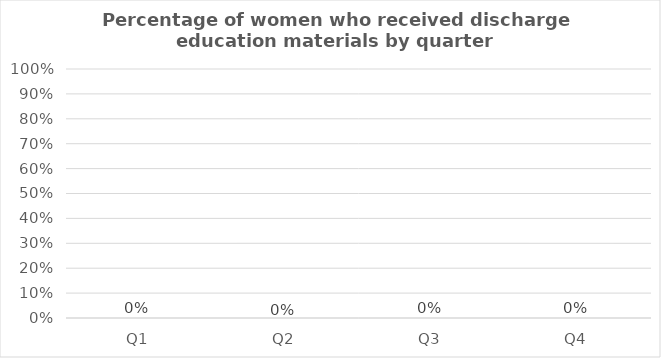
| Category | Percentage of women who received discharge education materials |
|---|---|
| Q1 | 0 |
| Q2 | 0 |
| Q3 | 0 |
| Q4 | 0 |